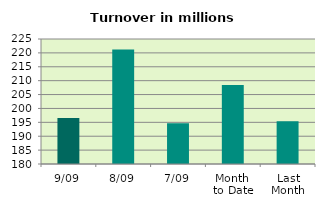
| Category | Series 0 |
|---|---|
| 9/09 | 196.54 |
| 8/09 | 221.218 |
| 7/09 | 194.673 |
| Month 
to Date | 208.411 |
| Last
Month | 195.366 |